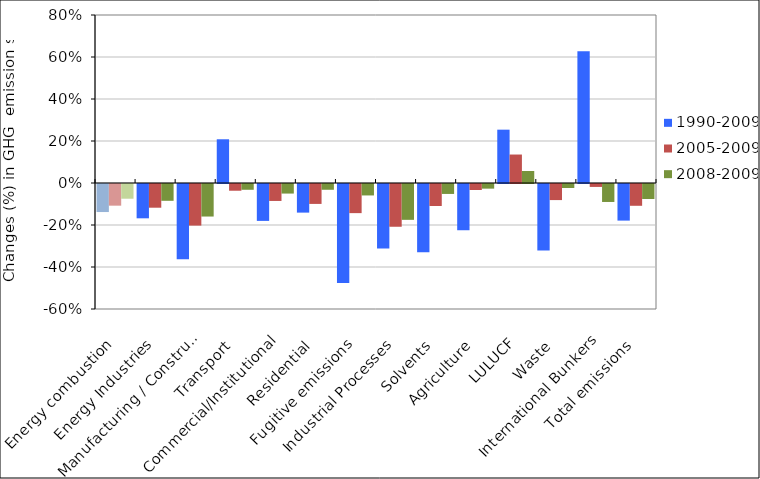
| Category | 1990-2009 | 2005-2009 | 2008-2009 |
|---|---|---|---|
| Energy combustion | -0.134 | -0.103 | -0.07 |
| Energy Industries | -0.163 | -0.113 | -0.08 |
| Manufacturing / Construction | -0.358 | -0.198 | -0.155 |
| Transport | 0.208 | -0.032 | -0.028 |
| Commercial/Institutional | -0.176 | -0.081 | -0.046 |
| Residential | -0.136 | -0.095 | -0.027 |
| Fugitive emissions | -0.472 | -0.139 | -0.055 |
| Industrial Processes | -0.308 | -0.204 | -0.171 |
| Solvents  | -0.325 | -0.105 | -0.047 |
| Agriculture | -0.22 | -0.028 | -0.022 |
| LULUCF | 0.254 | 0.136 | 0.057 |
| Waste | -0.316 | -0.077 | -0.019 |
| International Bunkers | 0.627 | -0.014 | -0.086 |
| Total emissions | -0.174 | -0.104 | -0.071 |